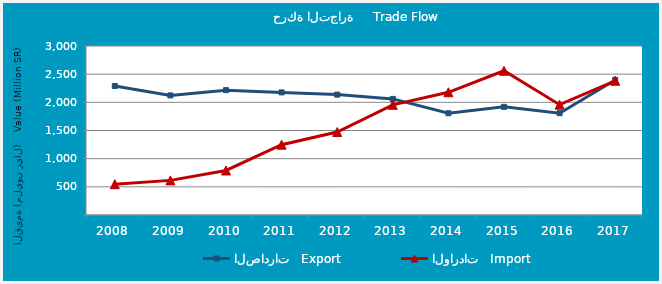
| Category | الصادرات   Export | الواردات   Import |
|---|---|---|
| 2008.0 | 2290642054 | 546573695 |
| 2009.0 | 2123155279 | 614598156 |
| 2010.0 | 2216267756 | 790419426 |
| 2011.0 | 2176351386 | 1248508262 |
| 2012.0 | 2137047340 | 1473274613 |
| 2013.0 | 2060599286 | 1955577939 |
| 2014.0 | 1806443293 | 2178448547 |
| 2015.0 | 1920429433 | 2560161115 |
| 2016.0 | 1807162537 | 1958657280 |
| 2017.0 | 2397890252 | 2382999986 |